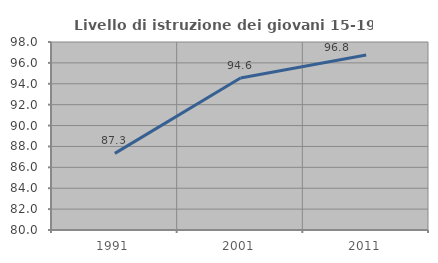
| Category | Livello di istruzione dei giovani 15-19 anni |
|---|---|
| 1991.0 | 87.335 |
| 2001.0 | 94.562 |
| 2011.0 | 96.756 |